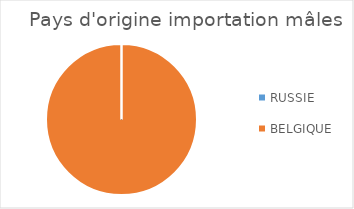
| Category | Series 0 |
|---|---|
| RUSSIE | 0 |
| BELGIQUE | 1 |